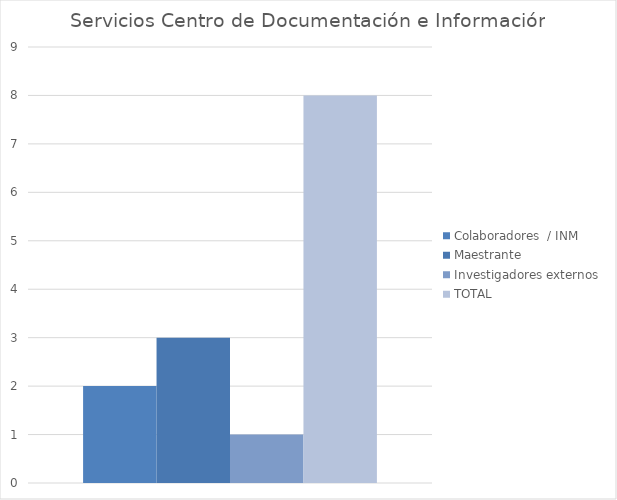
| Category | Colaboradores  / INM | Maestrante | Investigadores externos | TOTAL  |
|---|---|---|---|---|
| 0 | 2 | 3 | 1 | 8 |